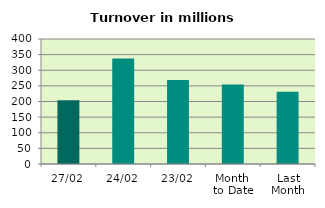
| Category | Series 0 |
|---|---|
| 27/02 | 204.115 |
| 24/02 | 337.271 |
| 23/02 | 269.151 |
| Month 
to Date | 254.796 |
| Last
Month | 231.348 |